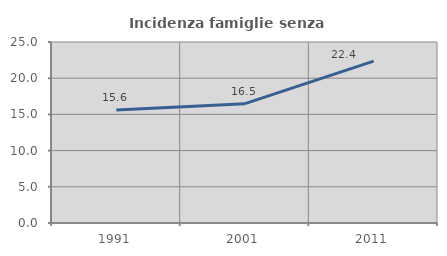
| Category | Incidenza famiglie senza nuclei |
|---|---|
| 1991.0 | 15.601 |
| 2001.0 | 16.485 |
| 2011.0 | 22.352 |